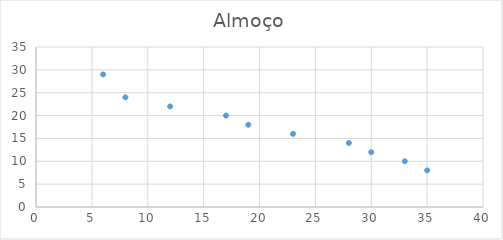
| Category | Almoço |
|---|---|
| 35.0 | 8 |
| 33.0 | 10 |
| 30.0 | 12 |
| 28.0 | 14 |
| 23.0 | 16 |
| 19.0 | 18 |
| 17.0 | 20 |
| 12.0 | 22 |
| 8.0 | 24 |
| 6.0 | 29 |